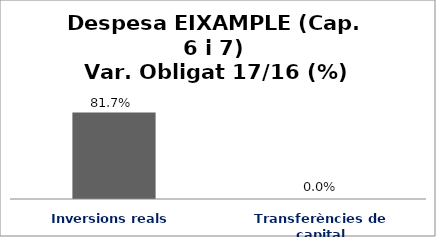
| Category | Series 0 |
|---|---|
| Inversions reals | 0.817 |
| Transferències de capital | 0 |